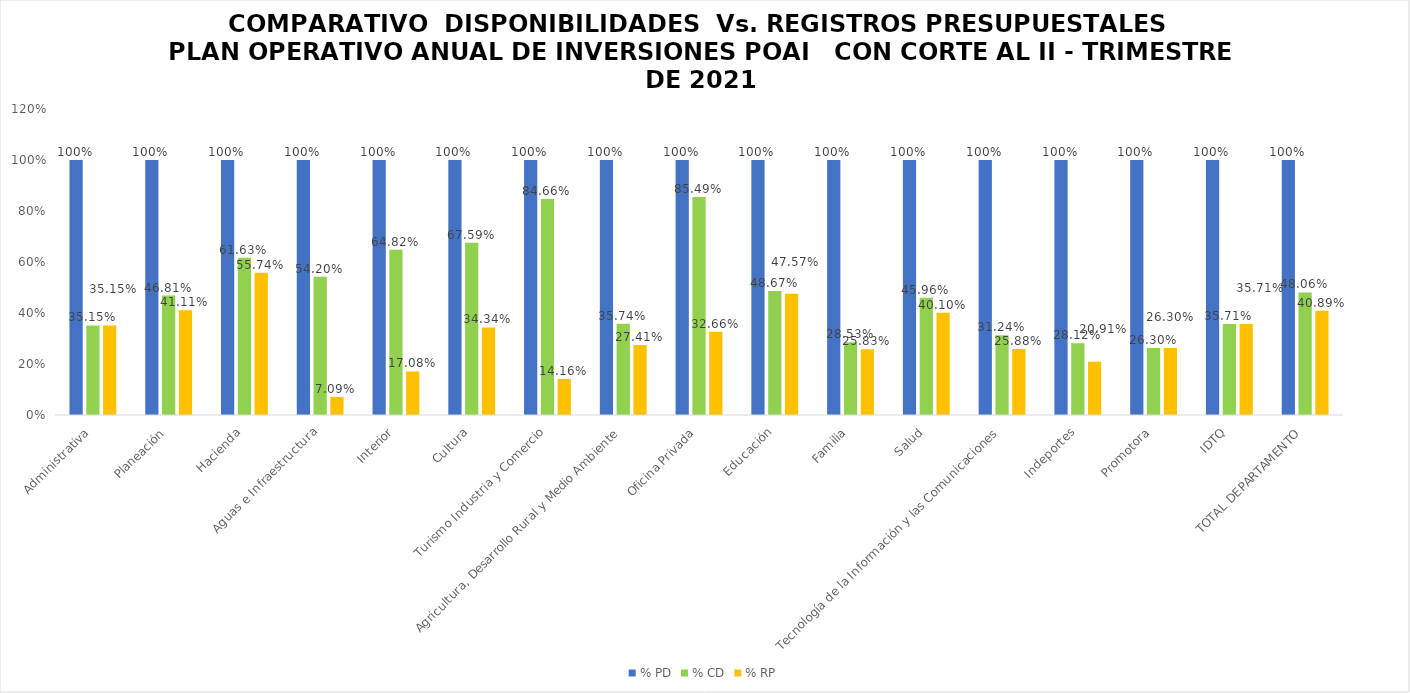
| Category | % PD | % CD | % RP |
|---|---|---|---|
| Administrativa | 1 | 0.351 | 0.351 |
| Planeación | 1 | 0.468 | 0.411 |
| Hacienda | 1 | 0.616 | 0.557 |
| Aguas e Infraestructura | 1 | 0.542 | 0.071 |
| Interior | 1 | 0.648 | 0.171 |
| Cultura | 1 | 0.676 | 0.343 |
| Turismo Industria y Comercio | 1 | 0.847 | 0.142 |
| Agricultura, Desarrollo Rural y Medio Ambiente | 1 | 0.357 | 0.274 |
| Oficina Privada | 1 | 0.855 | 0.327 |
| Educación | 1 | 0.487 | 0.476 |
| Familia | 1 | 0.285 | 0.258 |
| Salud | 1 | 0.46 | 0.401 |
| Tecnología de la Información y las Comunicaciones | 1 | 0.312 | 0.259 |
| Indeportes | 1 | 0.281 | 0.209 |
| Promotora | 1 | 0.263 | 0.263 |
| IDTQ | 1 | 0.357 | 0.357 |
| TOTAL DEPARTAMENTO | 1 | 0.481 | 0.409 |